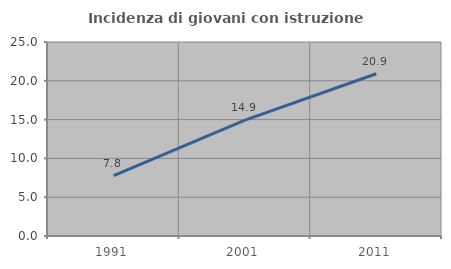
| Category | Incidenza di giovani con istruzione universitaria |
|---|---|
| 1991.0 | 7.767 |
| 2001.0 | 14.926 |
| 2011.0 | 20.904 |